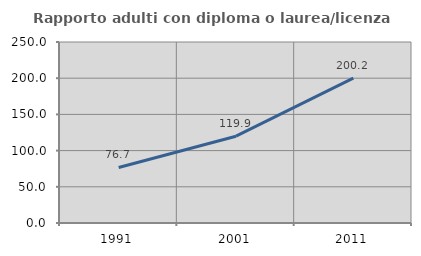
| Category | Rapporto adulti con diploma o laurea/licenza media  |
|---|---|
| 1991.0 | 76.698 |
| 2001.0 | 119.886 |
| 2011.0 | 200.212 |